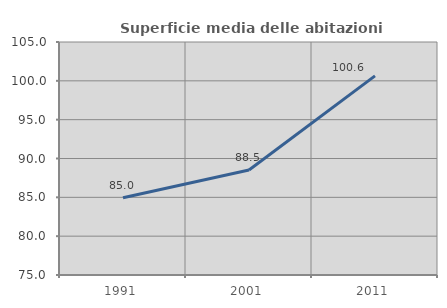
| Category | Superficie media delle abitazioni occupate |
|---|---|
| 1991.0 | 84.951 |
| 2001.0 | 88.518 |
| 2011.0 | 100.645 |